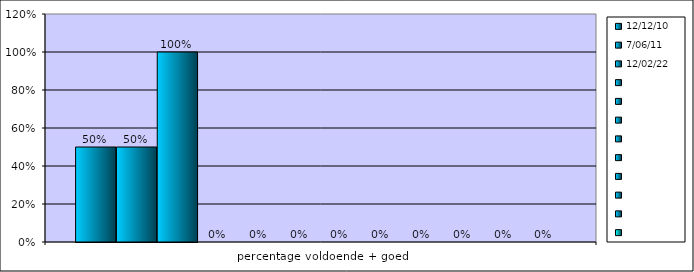
| Category | 12-12-10 | 7-06-11 | 12-02-22 | Series 3 | Series 4 | Series 5 | Series 6 | Series 7 | Series 8 | Series 9 | Series 10 | Series 11 |
|---|---|---|---|---|---|---|---|---|---|---|---|---|
| percentage voldoende + goed | 0.5 | 0.5 | 1 | 0 | 0 | 0 | 0 | 0 | 0 | 0 | 0 | 0 |